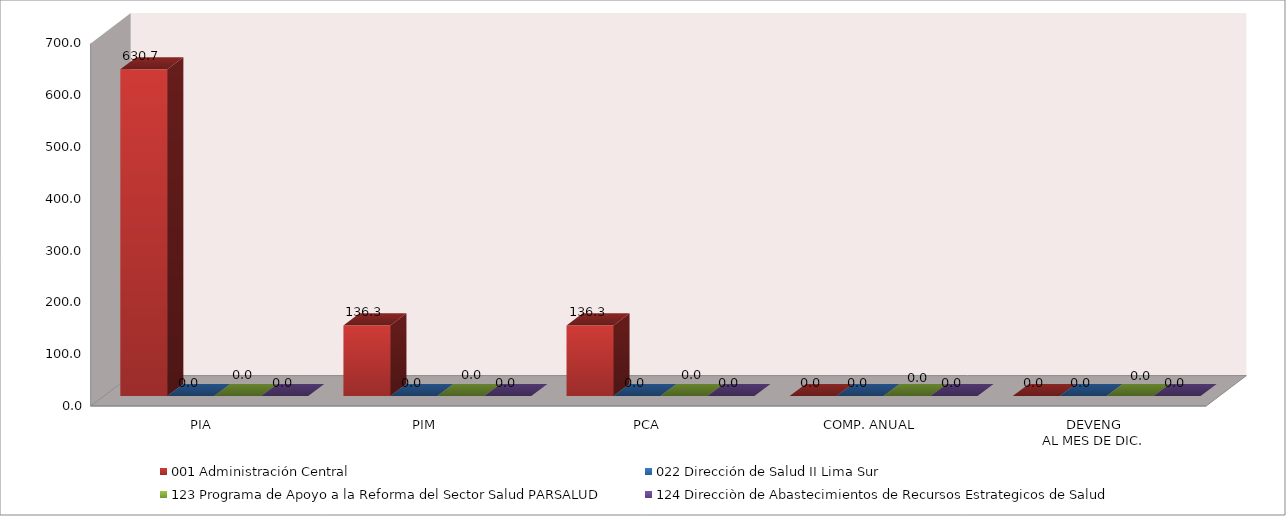
| Category | 001 Administración Central | 022 Dirección de Salud II Lima Sur | 123 Programa de Apoyo a la Reforma del Sector Salud PARSALUD | 124 Direcciòn de Abastecimientos de Recursos Estrategicos de Salud |
|---|---|---|---|---|
| PIA | 630.715 | 0 | 0 | 0 |
| PIM | 136.267 | 0 | 0 | 0 |
| PCA | 136.267 | 0 | 0 | 0 |
| COMP. ANUAL | 0 | 0 | 0 | 0 |
| DEVENG
AL MES DE DIC. | 0 | 0 | 0 | 0 |